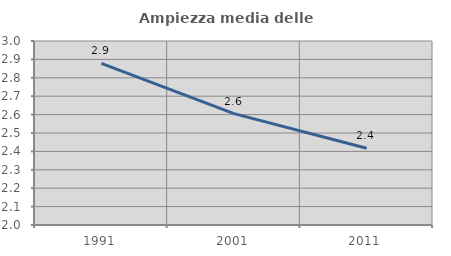
| Category | Ampiezza media delle famiglie |
|---|---|
| 1991.0 | 2.878 |
| 2001.0 | 2.606 |
| 2011.0 | 2.417 |